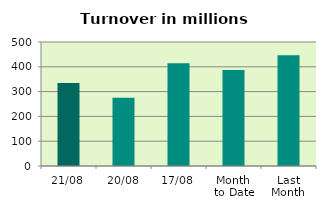
| Category | Series 0 |
|---|---|
| 21/08 | 334.22 |
| 20/08 | 274.859 |
| 17/08 | 414.544 |
| Month 
to Date | 387.149 |
| Last
Month | 446.279 |